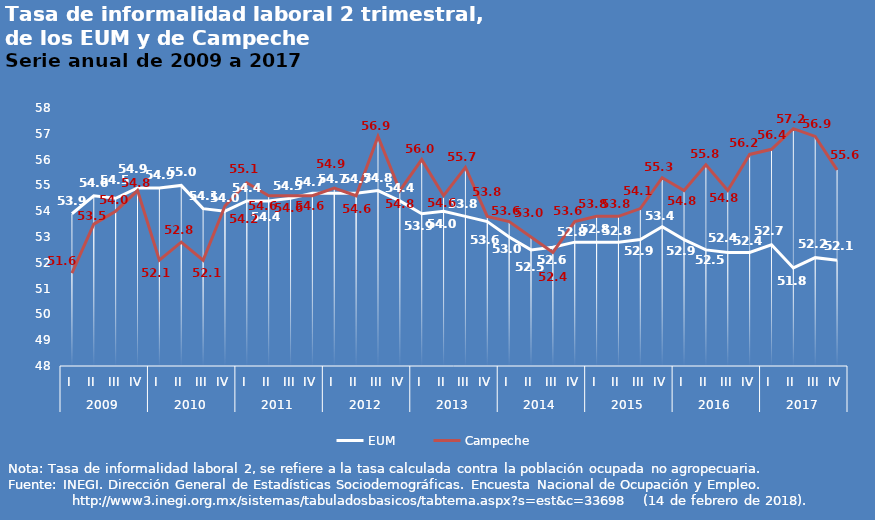
| Category | EUM | Campeche |
|---|---|---|
| 0 | 53.9 | 51.6 |
| 1 | 54.6 | 53.5 |
| 2 | 54.5 | 54 |
| 3 | 54.9 | 54.8 |
| 4 | 54.9 | 52.1 |
| 5 | 55 | 52.8 |
| 6 | 54.1 | 52.1 |
| 7 | 54 | 54.2 |
| 8 | 54.4 | 55.1 |
| 9 | 54.4 | 54.6 |
| 10 | 54.5 | 54.6 |
| 11 | 54.7 | 54.6 |
| 12 | 54.7 | 54.9 |
| 13 | 54.7 | 54.6 |
| 14 | 54.8 | 56.9 |
| 15 | 54.4 | 54.8 |
| 16 | 53.9 | 56 |
| 17 | 54 | 54.6 |
| 18 | 53.8 | 55.7 |
| 19 | 53.6 | 53.8 |
| 20 | 53 | 53.6 |
| 21 | 52.5 | 53 |
| 22 | 52.6 | 52.4 |
| 23 | 52.8 | 53.6 |
| 24 | 52.8 | 53.8 |
| 25 | 52.8 | 53.8 |
| 26 | 52.9 | 54.1 |
| 27 | 53.4 | 55.3 |
| 28 | 52.9 | 54.8 |
| 29 | 52.5 | 55.8 |
| 30 | 52.4 | 54.8 |
| 31 | 52.4 | 56.2 |
| 32 | 52.7 | 56.4 |
| 33 | 51.8 | 57.2 |
| 34 | 52.2 | 56.9 |
| 35 | 52.1 | 55.6 |